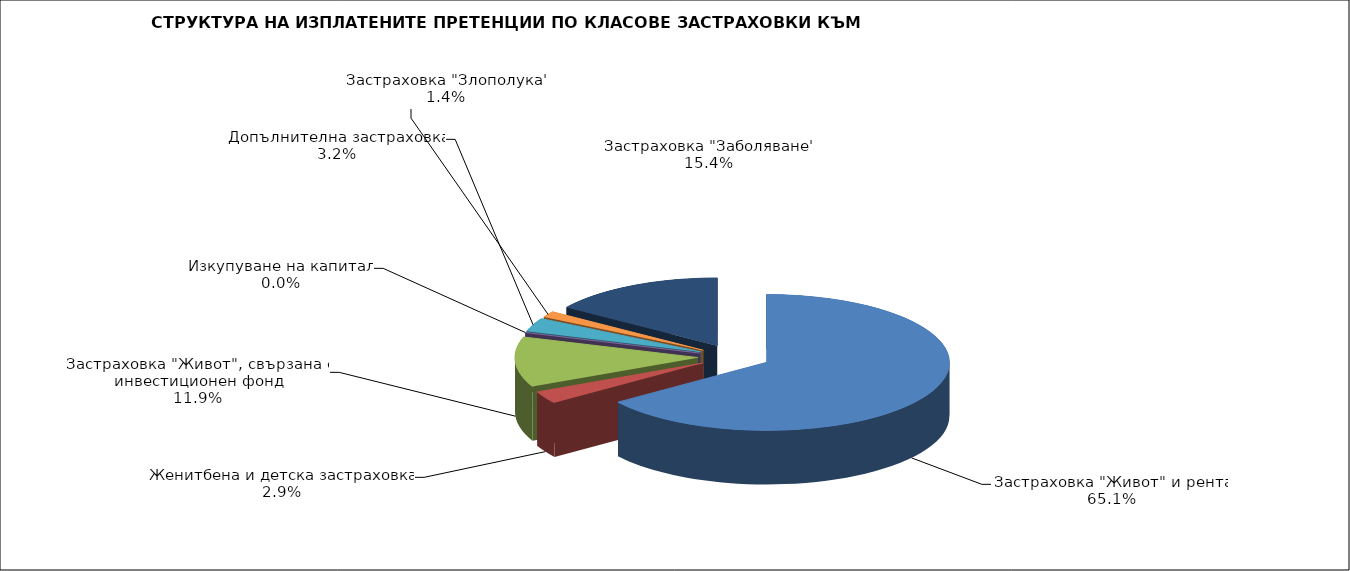
| Category | 95 770 222 |
|---|---|
| Застраховка "Живот" и рента | 95770222.368 |
| Женитбена и детска застраховка | 4333772.221 |
| Застраховка "Живот", свързана с инвестиционен фонд | 17526801.823 |
| Изкупуване на капитал | 0 |
| Допълнителна застраховка | 4768539.16 |
| Застраховка "Злополука" | 2121930.905 |
| Застраховка "Заболяване" | 22689062.404 |